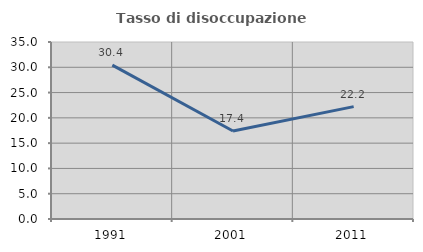
| Category | Tasso di disoccupazione giovanile  |
|---|---|
| 1991.0 | 30.435 |
| 2001.0 | 17.391 |
| 2011.0 | 22.222 |